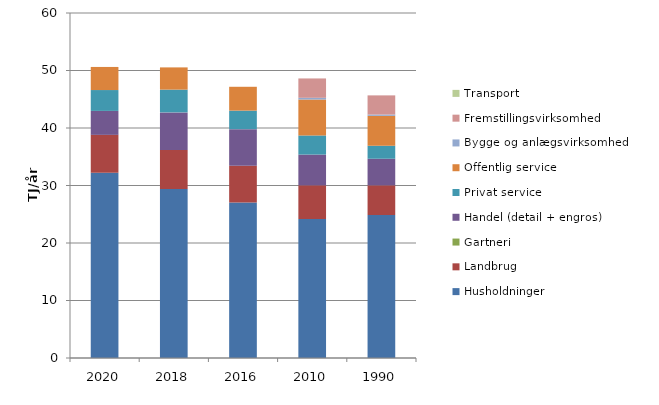
| Category | Husholdninger | Landbrug | Gartneri | Handel (detail + engros) | Privat service | Offentlig service | Bygge og anlægsvirksomhed | Fremstillingsvirksomhed | Transport |
|---|---|---|---|---|---|---|---|---|---|
| 2020.0 | 32.231 | 6.577 | 0 | 4.163 | 3.631 | 4.015 | 0 | 0 | 0 |
| 2018.0 | 29.378 | 6.775 | 0 | 6.563 | 3.959 | 3.865 | 0 | 0 | 0 |
| 2016.0 | 27.024 | 6.416 | 0 | 6.358 | 3.223 | 4.146 | 0 | 0 | 0 |
| 2010.0 | 24.188 | 5.836 | 0 | 5.353 | 3.326 | 6.25 | 0.299 | 3.366 | 0 |
| 1990.0 | 24.867 | 5.162 | 0 | 4.623 | 2.258 | 5.201 | 0.23 | 3.332 | 0 |